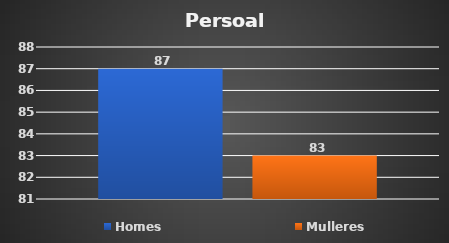
| Category | Homes | Mulleres |
|---|---|---|
| 0 | 87 | 83 |